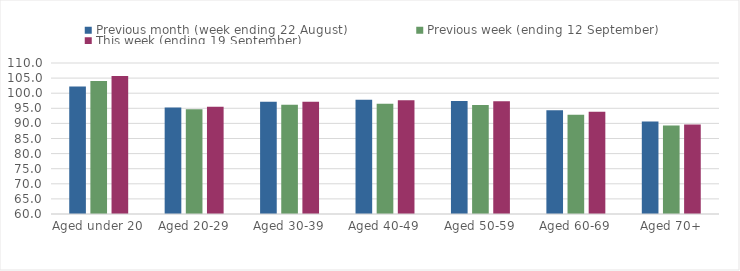
| Category | Previous month (week ending 22 August) | Previous week (ending 12 September) | This week (ending 19 September) |
|---|---|---|---|
| Aged under 20 | 102.2 | 104 | 105.73 |
| Aged 20-29 | 95.28 | 94.66 | 95.51 |
| Aged 30-39 | 97.19 | 96.21 | 97.17 |
| Aged 40-49 | 97.8 | 96.52 | 97.65 |
| Aged 50-59 | 97.45 | 96.08 | 97.35 |
| Aged 60-69 | 94.35 | 92.83 | 93.82 |
| Aged 70+ | 90.67 | 89.31 | 89.64 |